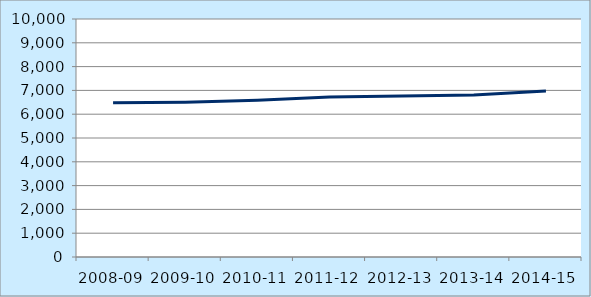
| Category | Average patient list size per practice |
|---|---|
| 2008-09 | 6476.44 |
| 2009-10 | 6506.581 |
| 2010-11 | 6587.778 |
| 2011-12 | 6720.544 |
| 2012-13 | 6760.637 |
| 2013-14 | 6807.563 |
| 2014-15 | 6975.362 |